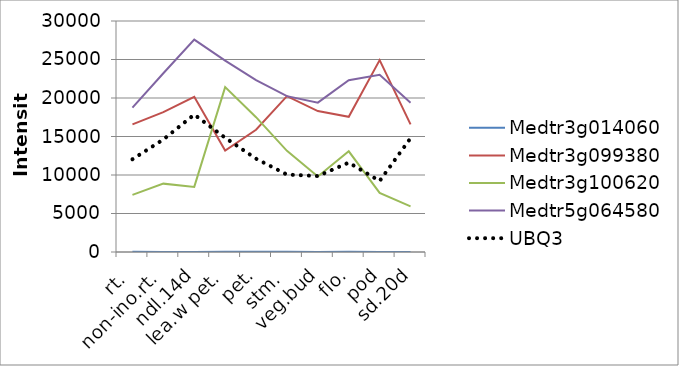
| Category | Medtr3g014060 | Medtr3g099380 | Medtr3g100620 | Medtr5g064580 | UBQ3 |
|---|---|---|---|---|---|
| rt. | 17.65 | 16567.1 | 7426.49 | 18753.1 | 12045.2 |
| non-ino.rt. | 14.63 | 18168.46 | 8877.99 | 23209.73 | 14609.86 |
| ndl.14d | 7.97 | 20148.43 | 8458.12 | 27585.8 | 17849.43 |
| lea.w pet. | 27.07 | 13170.1 | 21417.23 | 24862.86 | 14836 |
| pet. | 34.21 | 15875.96 | 17511.43 | 22323.43 | 12116.6 |
| stm. | 31.89 | 20242.23 | 13139.83 | 20237.33 | 10054.36 |
| veg.bud | 7.96 | 18304.56 | 9798.67 | 19396.83 | 9863.88 |
| flo. | 28.65 | 17553.23 | 13078.16 | 22308.36 | 11607.4 |
| pod | 13.52 | 24923.66 | 7668.02 | 23006.46 | 9222.41 |
| sd.20d | 14.67 | 16573.43 | 5926.81 | 19369.83 | 14787.86 |